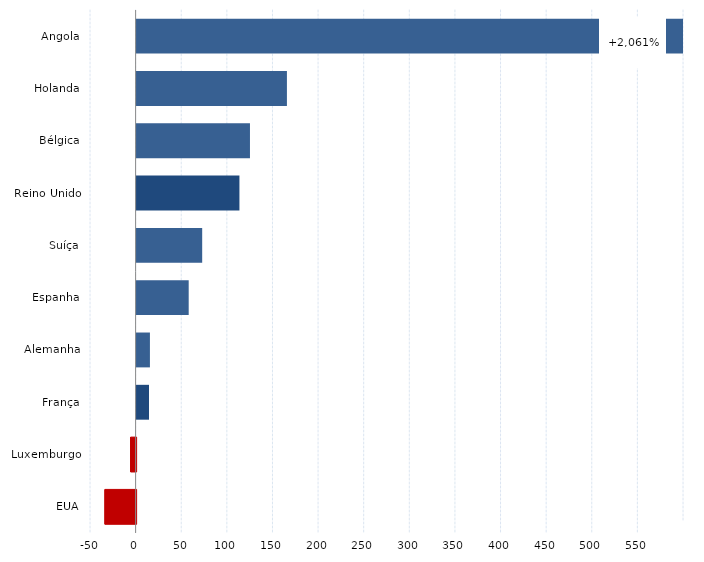
| Category | Series 0 |
|---|---|
| Angola | 2061.275 |
| Holanda | 164.757 |
| Bélgica | 124.242 |
| Reino Unido | 112.698 |
| Suíça | 71.876 |
| Espanha | 57.088 |
| Alemanha | 14.586 |
| França | 13.602 |
| Luxemburgo | -6.05 |
| EUA | -34.214 |